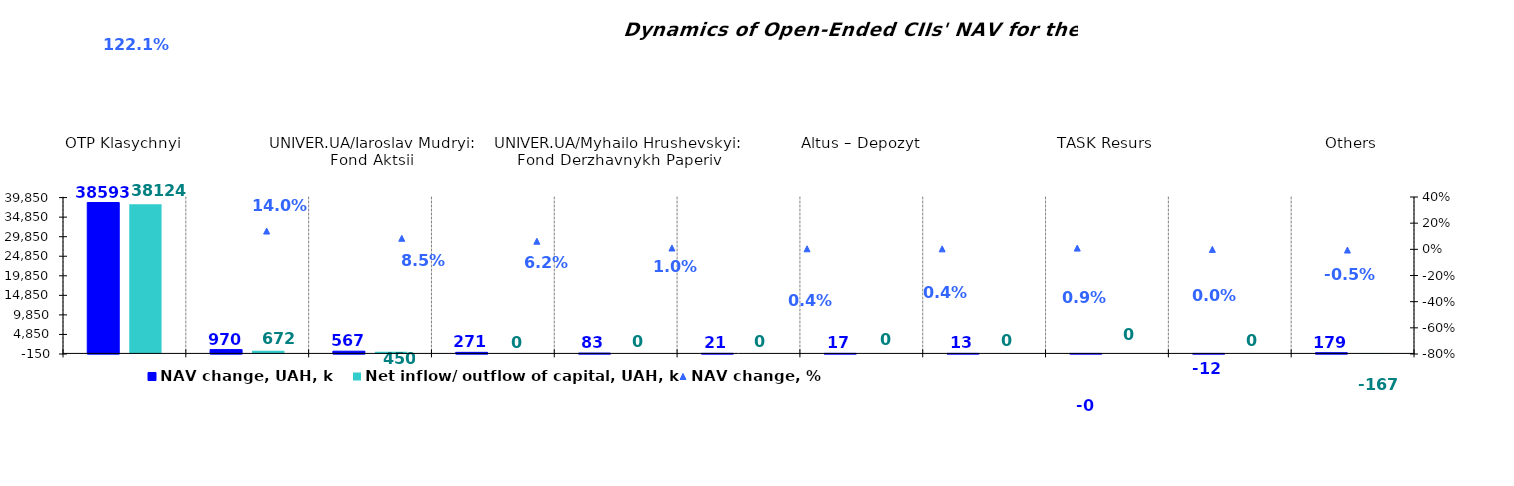
| Category | NAV change, UAH, k | Net inflow/ outflow of capital, UAH, k |
|---|---|---|
| OTP Klasychnyi | 38592.633 | 38124.225 |
| OTP Fond Aktsii | 970.043 | 672.076 |
| UNIVER.UA/Iaroslav Mudryi: Fond Aktsii | 567.02 | 449.839 |
| Sofiivskyi | 270.66 | 0 |
| UNIVER.UA/Myhailo Hrushevskyi: Fond Derzhavnykh Paperiv | 82.706 | 0 |
| КІNTO-Ekviti | 20.981 | 0 |
| Altus – Depozyt | 17.364 | 0 |
| UNIVER.UA/Taras Shevchenko: Fond Zaoshchadzhen | 13.238 | 0 |
| ТАSK Resurs | -0.352 | 0 |
| VSI | -11.979 | 0 |
| Others | 178.854 | -167 |